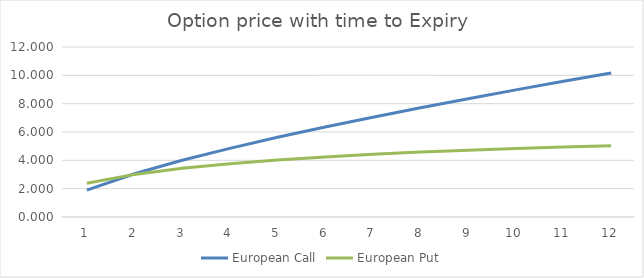
| Category | European Call | European Put |
|---|---|---|
| 1.0 | 1.9 | 2.376 |
| 2.0 | 3.053 | 3.007 |
| 3.0 | 4.002 | 3.437 |
| 4.0 | 4.847 | 3.764 |
| 5.0 | 5.624 | 4.026 |
| 6.0 | 6.353 | 4.242 |
| 7.0 | 7.047 | 4.425 |
| 8.0 | 7.712 | 4.581 |
| 9.0 | 8.353 | 4.716 |
| 10.0 | 8.975 | 4.833 |
| 11.0 | 9.58 | 4.935 |
| 12.0 | 10.17 | 5.025 |